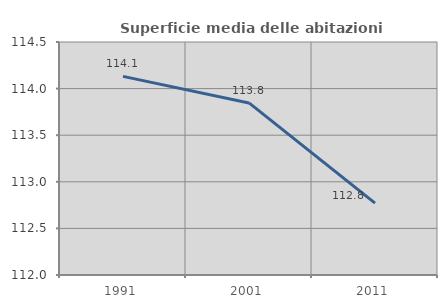
| Category | Superficie media delle abitazioni occupate |
|---|---|
| 1991.0 | 114.131 |
| 2001.0 | 113.846 |
| 2011.0 | 112.77 |